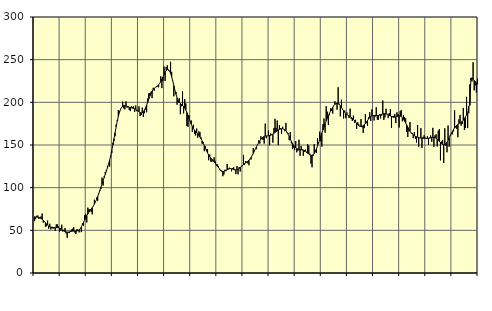
| Category | Piggar | Series 1 |
|---|---|---|
| nan | 60.8 | 65.96 |
| 87.0 | 63.1 | 65.61 |
| 87.0 | 67.1 | 65.67 |
| 87.0 | 67.3 | 65.45 |
| 87.0 | 63.4 | 65.14 |
| 87.0 | 65.6 | 64.65 |
| 87.0 | 66.3 | 63.93 |
| 87.0 | 69.7 | 62.98 |
| 87.0 | 59 | 61.79 |
| 87.0 | 60.3 | 60.44 |
| 87.0 | 54.1 | 58.94 |
| 87.0 | 54.8 | 57.43 |
| nan | 61.5 | 56.09 |
| 88.0 | 51.9 | 55.03 |
| 88.0 | 57.7 | 54.25 |
| 88.0 | 51.1 | 53.73 |
| 88.0 | 54.1 | 53.44 |
| 88.0 | 51.9 | 53.3 |
| 88.0 | 52.7 | 53.25 |
| 88.0 | 49.6 | 53.24 |
| 88.0 | 57 | 53.21 |
| 88.0 | 56.9 | 53.15 |
| 88.0 | 54.7 | 52.97 |
| 88.0 | 48 | 52.6 |
| nan | 49.7 | 52 |
| 89.0 | 56.6 | 51.18 |
| 89.0 | 48.5 | 50.27 |
| 89.0 | 50.6 | 49.41 |
| 89.0 | 52.6 | 48.7 |
| 89.0 | 46.4 | 48.21 |
| 89.0 | 41.2 | 47.99 |
| 89.0 | 47.5 | 48.01 |
| 89.0 | 46.8 | 48.23 |
| 89.0 | 49.5 | 48.51 |
| 89.0 | 50.9 | 48.81 |
| 89.0 | 51.9 | 49.04 |
| nan | 53.8 | 49.15 |
| 90.0 | 47.4 | 49.19 |
| 90.0 | 45.7 | 49.21 |
| 90.0 | 51.5 | 49.33 |
| 90.0 | 50.2 | 49.7 |
| 90.0 | 47.6 | 50.51 |
| 90.0 | 52 | 51.93 |
| 90.0 | 47.9 | 53.96 |
| 90.0 | 58.2 | 56.42 |
| 90.0 | 55.3 | 59.14 |
| 90.0 | 67.7 | 61.91 |
| 90.0 | 69.4 | 64.6 |
| nan | 59.2 | 67.09 |
| 91.0 | 76.6 | 69.34 |
| 91.0 | 74.8 | 71.36 |
| 91.0 | 74.7 | 73.17 |
| 91.0 | 71.6 | 74.87 |
| 91.0 | 68.7 | 76.61 |
| 91.0 | 78.3 | 78.54 |
| 91.0 | 85.9 | 80.75 |
| 91.0 | 83.2 | 83.31 |
| 91.0 | 88.4 | 86.21 |
| 91.0 | 84.7 | 89.48 |
| 91.0 | 93.6 | 93.04 |
| nan | 96 | 96.8 |
| 92.0 | 98.5 | 100.65 |
| 92.0 | 111.8 | 104.45 |
| 92.0 | 102.5 | 108.19 |
| 92.0 | 113.5 | 111.9 |
| 92.0 | 118.5 | 115.61 |
| 92.0 | 120.8 | 119.36 |
| 92.0 | 125.7 | 123.25 |
| 92.0 | 128 | 127.45 |
| 92.0 | 124.7 | 132.18 |
| 92.0 | 135.9 | 137.53 |
| 92.0 | 140.5 | 143.57 |
| nan | 152.6 | 150.21 |
| 93.0 | 154.7 | 157.26 |
| 93.0 | 160.3 | 164.43 |
| 93.0 | 174 | 171.39 |
| 93.0 | 179.4 | 177.87 |
| 93.0 | 190.9 | 183.56 |
| 93.0 | 189.6 | 188.23 |
| 93.0 | 191.1 | 191.76 |
| 93.0 | 193.6 | 194.16 |
| 93.0 | 200.8 | 195.57 |
| 93.0 | 192.9 | 196.19 |
| 93.0 | 191.8 | 196.2 |
| nan | 201.1 | 195.84 |
| 94.0 | 193.6 | 195.29 |
| 94.0 | 195.6 | 194.73 |
| 94.0 | 191.1 | 194.27 |
| 94.0 | 189.7 | 193.88 |
| 94.0 | 195.3 | 193.54 |
| 94.0 | 194.6 | 193.22 |
| 94.0 | 195.2 | 192.87 |
| 94.0 | 188.6 | 192.44 |
| 94.0 | 196.3 | 191.84 |
| 94.0 | 189.6 | 191 |
| 94.0 | 190.2 | 189.99 |
| nan | 195.3 | 188.96 |
| 95.0 | 183.9 | 188.1 |
| 95.0 | 185.3 | 187.67 |
| 95.0 | 193.8 | 187.92 |
| 95.0 | 182.8 | 189 |
| 95.0 | 187.3 | 190.91 |
| 95.0 | 191.6 | 193.56 |
| 95.0 | 188.3 | 196.8 |
| 95.0 | 204.5 | 200.39 |
| 95.0 | 210.6 | 204.04 |
| 95.0 | 210.9 | 207.49 |
| 95.0 | 212.3 | 210.57 |
| nan | 204.9 | 213.07 |
| 96.0 | 217 | 214.99 |
| 96.0 | 213.7 | 216.41 |
| 96.0 | 217.3 | 217.43 |
| 96.0 | 218.9 | 218.3 |
| 96.0 | 218.6 | 219.3 |
| 96.0 | 217.7 | 220.57 |
| 96.0 | 222.2 | 222.22 |
| 96.0 | 230.4 | 224.33 |
| 96.0 | 216.7 | 226.87 |
| 96.0 | 225.1 | 229.72 |
| 96.0 | 242 | 232.62 |
| nan | 225 | 235.28 |
| 97.0 | 241.5 | 237.34 |
| 97.0 | 243.3 | 238.43 |
| 97.0 | 237.2 | 238.34 |
| 97.0 | 236.3 | 236.92 |
| 97.0 | 247.5 | 234.09 |
| 97.0 | 235.7 | 230.04 |
| 97.0 | 225.5 | 225.08 |
| 97.0 | 207 | 219.61 |
| 97.0 | 214.1 | 214.16 |
| 97.0 | 212.2 | 209.32 |
| 97.0 | 197.2 | 205.32 |
| nan | 199.8 | 202.27 |
| 98.0 | 204.9 | 200.13 |
| 98.0 | 186.1 | 198.67 |
| 98.0 | 195.3 | 197.57 |
| 98.0 | 212.8 | 196.51 |
| 98.0 | 187 | 195.19 |
| 98.0 | 203.9 | 193.33 |
| 98.0 | 198.7 | 190.93 |
| 98.0 | 172.4 | 188.03 |
| 98.0 | 171.3 | 184.73 |
| 98.0 | 185 | 181.18 |
| 98.0 | 177.9 | 177.67 |
| nan | 178.8 | 174.45 |
| 99.0 | 165.4 | 171.68 |
| 99.0 | 173.7 | 169.42 |
| 99.0 | 163.3 | 167.62 |
| 99.0 | 161.2 | 166.04 |
| 99.0 | 169.3 | 164.52 |
| 99.0 | 158.5 | 162.98 |
| 99.0 | 165.9 | 161.26 |
| 99.0 | 165 | 159.33 |
| 99.0 | 158.8 | 157.21 |
| 99.0 | 151.4 | 154.81 |
| 99.0 | 153.6 | 152.09 |
| nan | 142.7 | 149.16 |
| 0.0 | 148.5 | 146.18 |
| 0.0 | 145.3 | 143.31 |
| 0.0 | 145.1 | 140.66 |
| 0.0 | 132.1 | 138.34 |
| 0.0 | 138.8 | 136.36 |
| 0.0 | 130.5 | 134.67 |
| 0.0 | 130.3 | 133.2 |
| 0.0 | 131.3 | 131.78 |
| 0.0 | 135.5 | 130.33 |
| 0.0 | 131.4 | 128.76 |
| 0.0 | 125.7 | 127.08 |
| nan | 127.4 | 125.3 |
| 1.0 | 125.3 | 123.54 |
| 1.0 | 121.4 | 121.91 |
| 1.0 | 119.4 | 120.56 |
| 1.0 | 119.1 | 119.58 |
| 1.0 | 113.4 | 119.09 |
| 1.0 | 115.4 | 119.09 |
| 1.0 | 121.1 | 119.5 |
| 1.0 | 119.4 | 120.19 |
| 1.0 | 127.8 | 120.95 |
| 1.0 | 122.3 | 121.63 |
| 1.0 | 123.4 | 122.12 |
| nan | 122.1 | 122.32 |
| 2.0 | 119.2 | 122.18 |
| 2.0 | 123 | 121.77 |
| 2.0 | 123.9 | 121.25 |
| 2.0 | 121.7 | 120.83 |
| 2.0 | 115.9 | 120.68 |
| 2.0 | 125.4 | 120.93 |
| 2.0 | 115.7 | 121.58 |
| 2.0 | 124.2 | 122.54 |
| 2.0 | 119 | 123.7 |
| 2.0 | 124.7 | 124.88 |
| 2.0 | 125.1 | 126.03 |
| nan | 138.4 | 127.09 |
| 3.0 | 126.5 | 128.08 |
| 3.0 | 131.1 | 129.03 |
| 3.0 | 130.4 | 129.95 |
| 3.0 | 128.5 | 130.97 |
| 3.0 | 126.3 | 132.18 |
| 3.0 | 133.4 | 133.65 |
| 3.0 | 133 | 135.46 |
| 3.0 | 137.9 | 137.68 |
| 3.0 | 146.4 | 140.17 |
| 3.0 | 142.6 | 142.83 |
| 3.0 | 145.6 | 145.52 |
| nan | 145.1 | 148.1 |
| 4.0 | 150.2 | 150.52 |
| 4.0 | 155.3 | 152.77 |
| 4.0 | 151.7 | 154.78 |
| 4.0 | 160.2 | 156.59 |
| 4.0 | 157.2 | 158.11 |
| 4.0 | 155.9 | 159.3 |
| 4.0 | 151.7 | 160.11 |
| 4.0 | 175.1 | 160.52 |
| 4.0 | 158 | 160.68 |
| 4.0 | 160.7 | 160.72 |
| 4.0 | 166.9 | 160.79 |
| nan | 149.6 | 161.01 |
| 5.0 | 163.5 | 161.42 |
| 5.0 | 162.3 | 162.03 |
| 5.0 | 152.8 | 162.83 |
| 5.0 | 170 | 163.74 |
| 5.0 | 180.7 | 164.69 |
| 5.0 | 169.8 | 165.67 |
| 5.0 | 178.7 | 166.66 |
| 5.0 | 149.7 | 167.52 |
| 5.0 | 173.1 | 168.16 |
| 5.0 | 169.8 | 168.66 |
| 5.0 | 163 | 168.96 |
| nan | 171.4 | 169.01 |
| 6.0 | 168.5 | 168.72 |
| 6.0 | 166.2 | 167.98 |
| 6.0 | 175.9 | 166.75 |
| 6.0 | 164.5 | 164.97 |
| 6.0 | 163.8 | 162.67 |
| 6.0 | 155.5 | 159.98 |
| 6.0 | 165.1 | 157.09 |
| 6.0 | 151.9 | 154.29 |
| 6.0 | 145.2 | 151.83 |
| 6.0 | 147.1 | 149.74 |
| 6.0 | 144.2 | 148.09 |
| nan | 154.6 | 146.86 |
| 7.0 | 141.4 | 145.91 |
| 7.0 | 143.3 | 145.2 |
| 7.0 | 156.2 | 144.74 |
| 7.0 | 137.3 | 144.52 |
| 7.0 | 148.9 | 144.46 |
| 7.0 | 143.7 | 144.37 |
| 7.0 | 137.3 | 144.1 |
| 7.0 | 141.8 | 143.58 |
| 7.0 | 144.6 | 142.78 |
| 7.0 | 140.6 | 141.74 |
| 7.0 | 151 | 140.5 |
| nan | 149.2 | 139.25 |
| 8.0 | 139.8 | 138.29 |
| 8.0 | 128.2 | 137.81 |
| 8.0 | 123.9 | 137.86 |
| 8.0 | 137.2 | 138.59 |
| 8.0 | 151 | 140.12 |
| 8.0 | 143.3 | 142.39 |
| 8.0 | 140.6 | 145.31 |
| 8.0 | 157.9 | 148.77 |
| 8.0 | 153.4 | 152.52 |
| 8.0 | 165.6 | 156.39 |
| 8.0 | 154.4 | 160.23 |
| nan | 148.1 | 163.95 |
| 9.0 | 174.3 | 167.53 |
| 9.0 | 181 | 171.05 |
| 9.0 | 164.4 | 174.59 |
| 9.0 | 195.5 | 178.01 |
| 9.0 | 189.1 | 181.2 |
| 9.0 | 173.4 | 184.24 |
| 9.0 | 184.9 | 187.1 |
| 9.0 | 192.9 | 189.73 |
| 9.0 | 190.3 | 192.11 |
| 9.0 | 186.8 | 194.24 |
| 9.0 | 196.2 | 196.07 |
| nan | 201.3 | 197.56 |
| 10.0 | 198.3 | 198.54 |
| 10.0 | 191.4 | 198.86 |
| 10.0 | 217.7 | 198.48 |
| 10.0 | 198.4 | 197.49 |
| 10.0 | 183.6 | 195.96 |
| 10.0 | 203.2 | 194.05 |
| 10.0 | 191.4 | 192 |
| 10.0 | 181.1 | 190.01 |
| 10.0 | 190.4 | 188.27 |
| 10.0 | 181.4 | 186.87 |
| 10.0 | 188.2 | 185.79 |
| nan | 185.1 | 184.94 |
| 11.0 | 181.6 | 184.16 |
| 11.0 | 192.7 | 183.35 |
| 11.0 | 180.7 | 182.43 |
| 11.0 | 178.1 | 181.3 |
| 11.0 | 184.4 | 179.96 |
| 11.0 | 176 | 178.44 |
| 11.0 | 179.6 | 176.82 |
| 11.0 | 168.9 | 175.26 |
| 11.0 | 176.7 | 173.86 |
| 11.0 | 174.2 | 172.76 |
| 11.0 | 171.6 | 172.03 |
| nan | 180.4 | 171.72 |
| 12.0 | 170.8 | 171.93 |
| 12.0 | 164.1 | 172.64 |
| 12.0 | 169.8 | 173.76 |
| 12.0 | 186.3 | 175.24 |
| 12.0 | 175.5 | 176.97 |
| 12.0 | 172.4 | 178.79 |
| 12.0 | 182.5 | 180.57 |
| 12.0 | 188.4 | 182.15 |
| 12.0 | 178.2 | 183.34 |
| 12.0 | 191.8 | 184.09 |
| 12.0 | 185.1 | 184.49 |
| nan | 178.7 | 184.6 |
| 13.0 | 183.2 | 184.57 |
| 13.0 | 194.2 | 184.55 |
| 13.0 | 179.8 | 184.63 |
| 13.0 | 179.4 | 184.76 |
| 13.0 | 186 | 185.04 |
| 13.0 | 181.2 | 185.49 |
| 13.0 | 184.4 | 186.01 |
| 13.0 | 202.1 | 186.44 |
| 13.0 | 179.4 | 186.71 |
| 13.0 | 182.4 | 186.76 |
| 13.0 | 192.5 | 186.51 |
| nan | 186.4 | 186.08 |
| 14.0 | 181.5 | 185.5 |
| 14.0 | 187.4 | 184.75 |
| 14.0 | 192.2 | 183.97 |
| 14.0 | 170 | 183.31 |
| 14.0 | 183.8 | 182.85 |
| 14.0 | 184.1 | 182.59 |
| 14.0 | 186.4 | 182.61 |
| 14.0 | 175.7 | 182.9 |
| 14.0 | 188.3 | 183.36 |
| 14.0 | 186.1 | 183.82 |
| 14.0 | 170.5 | 184.06 |
| nan | 189.7 | 183.88 |
| 15.0 | 191.1 | 183.22 |
| 15.0 | 177.7 | 182.02 |
| 15.0 | 185.1 | 180.3 |
| 15.0 | 182.7 | 178.21 |
| 15.0 | 181.2 | 175.83 |
| 15.0 | 165.4 | 173.29 |
| 15.0 | 159.4 | 170.75 |
| 15.0 | 166.1 | 168.33 |
| 15.0 | 176.9 | 166.19 |
| 15.0 | 163.7 | 164.41 |
| 15.0 | 163.8 | 162.99 |
| nan | 158 | 161.91 |
| 16.0 | 165.2 | 161.01 |
| 16.0 | 157.4 | 160.25 |
| 16.0 | 152.9 | 159.65 |
| 16.0 | 173.4 | 159.14 |
| 16.0 | 147.9 | 158.71 |
| 16.0 | 157.9 | 158.41 |
| 16.0 | 169.8 | 158.21 |
| 16.0 | 146.6 | 158.11 |
| 16.0 | 159.5 | 158 |
| 16.0 | 161.4 | 157.86 |
| 16.0 | 158.7 | 157.78 |
| nan | 157 | 157.74 |
| 17.0 | 160.4 | 157.69 |
| 17.0 | 150.2 | 157.76 |
| 17.0 | 158.6 | 157.99 |
| 17.0 | 161.1 | 158.28 |
| 17.0 | 153.7 | 158.63 |
| 17.0 | 170.1 | 158.9 |
| 17.0 | 147.9 | 158.9 |
| 17.0 | 161.3 | 158.61 |
| 17.0 | 162.5 | 157.95 |
| 17.0 | 148.3 | 156.9 |
| 17.0 | 166.9 | 155.56 |
| nan | 168.7 | 154.08 |
| 18.0 | 132 | 152.68 |
| 18.0 | 154 | 151.53 |
| 18.0 | 156 | 150.72 |
| 18.0 | 128.9 | 150.36 |
| 18.0 | 169.5 | 150.62 |
| 18.0 | 149.1 | 151.66 |
| 18.0 | 141.5 | 153.39 |
| 18.0 | 172.8 | 155.68 |
| 18.0 | 147.9 | 158.27 |
| 18.0 | 161.9 | 160.98 |
| 18.0 | 162.8 | 163.58 |
| nan | 162.6 | 165.93 |
| 19.0 | 165.9 | 168.12 |
| 19.0 | 190.6 | 170.07 |
| 19.0 | 170.5 | 171.71 |
| 19.0 | 168.7 | 173.14 |
| 19.0 | 159.1 | 174.27 |
| 19.0 | 180 | 175.09 |
| 19.0 | 185.3 | 175.87 |
| 19.0 | 172.7 | 176.68 |
| 19.0 | 174.6 | 177.67 |
| 19.0 | 193.5 | 179.08 |
| 19.0 | 167.6 | 180.9 |
| nan | 169.8 | 182.97 |
| 20.0 | 206.4 | 185.05 |
| 20.0 | 169.8 | 186.87 |
| 20.0 | 187.1 | 195.67 |
| 20.0 | 221.2 | 196.53 |
| 20.0 | 226 | 228.54 |
| 20.0 | 224.4 | 228.22 |
| 20.0 | 247 | 227.26 |
| 20.0 | 214.1 | 225.86 |
| 20.0 | 219.9 | 224.26 |
| 20.0 | 211.5 | 222.63 |
| 20.0 | 227.8 | 221.18 |